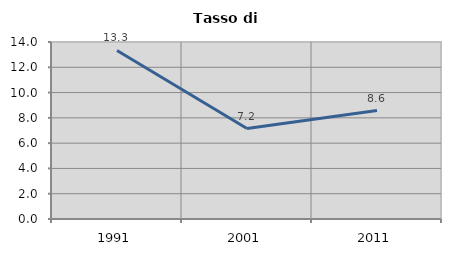
| Category | Tasso di disoccupazione   |
|---|---|
| 1991.0 | 13.328 |
| 2001.0 | 7.158 |
| 2011.0 | 8.576 |